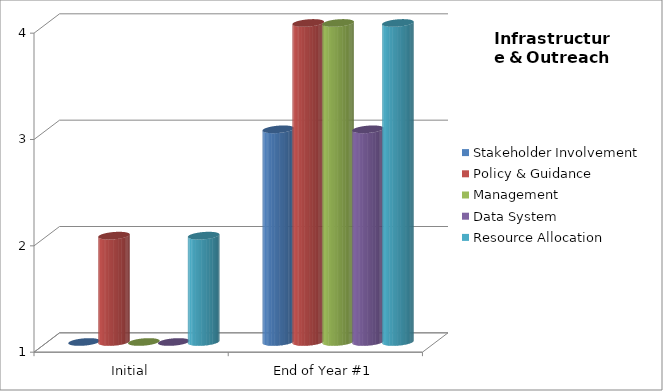
| Category | Stakeholder Involvement  | Policy & Guidance  | Management  | Data System  | Resource Allocation  |
|---|---|---|---|---|---|
| Initial | 1 | 2 | 1 | 1 | 2 |
| End of Year #1 | 3 | 4 | 4 | 3 | 4 |